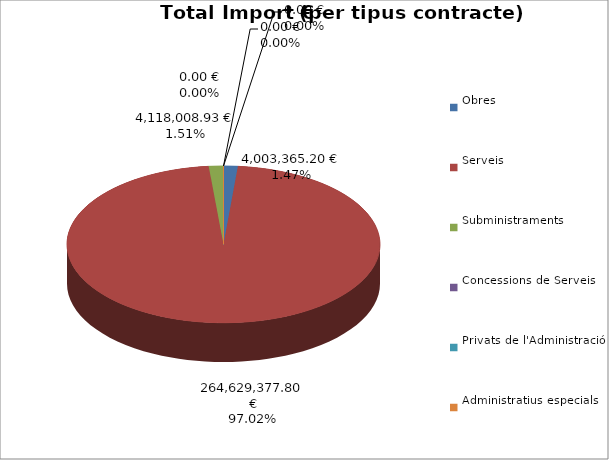
| Category | Total preu
(amb IVA) |
|---|---|
| Obres | 4003365.2 |
| Serveis | 264629377.8 |
| Subministraments | 4118008.93 |
| Concessions de Serveis | 0 |
| Privats de l'Administració | 0 |
| Administratius especials | 0 |